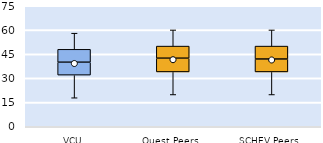
| Category | 25th | 50th | 75th |
|---|---|---|---|
| VCU | 32 | 8 | 8 |
| Quest Peers | 34 | 8.5 | 7.5 |
| SCHEV Peers | 34 | 8 | 8 |